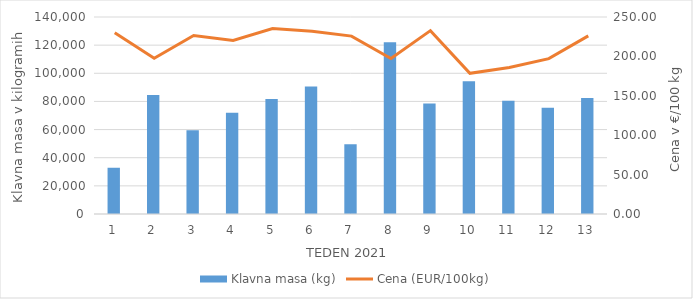
| Category | Klavna masa (kg) |
|---|---|
| 1.0 | 32871 |
| 2.0 | 84639 |
| 3.0 | 59476 |
| 4.0 | 72013 |
| 5.0 | 81759 |
| 6.0 | 90669 |
| 7.0 | 49517 |
| 8.0 | 122111 |
| 9.0 | 78545 |
| 10.0 | 94384 |
| 11.0 | 80405 |
| 12.0 | 75534 |
| 13.0 | 82440 |